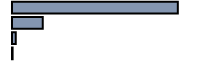
| Category | Series 0 |
|---|---|
| 0 | 82.5 |
| 1 | 15.3 |
| 2 | 1.9 |
| 3 | 0.3 |